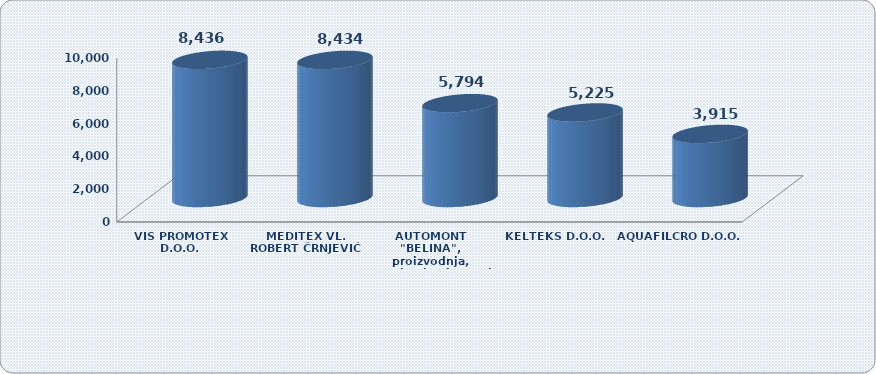
| Category | Dobit razdoblja |
|---|---|
| VIS PROMOTEX D.O.O. | 8436.479 |
| MEDITEX VL. ROBERT ČRNJEVIĆ | 8433.529 |
| AUTOMONT "BELINA", proizvodnja, trgovina i usluge, vl. B. Belina | 5793.875 |
| KELTEKS D.O.O. | 5224.896 |
| AQUAFILCRO D.O.O. | 3915.011 |